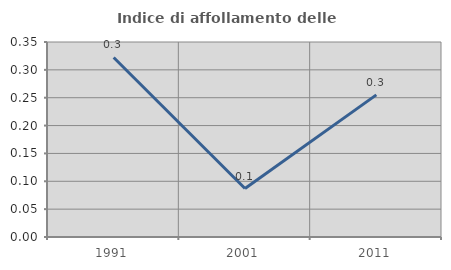
| Category | Indice di affollamento delle abitazioni  |
|---|---|
| 1991.0 | 0.322 |
| 2001.0 | 0.087 |
| 2011.0 | 0.255 |